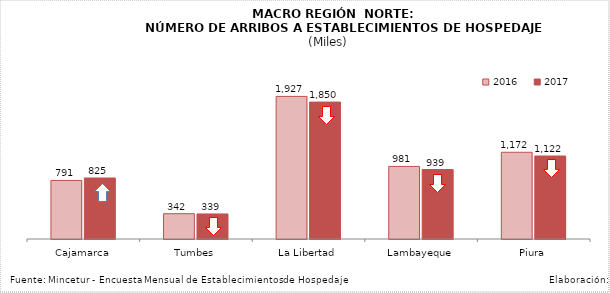
| Category | 2016 | 2017 |
|---|---|---|
| Cajamarca | 791.157 | 824.506 |
| Tumbes | 341.896 | 338.606 |
| La Libertad | 1926.907 | 1850.282 |
| Lambayeque | 980.673 | 938.572 |
| Piura | 1172.062 | 1121.565 |